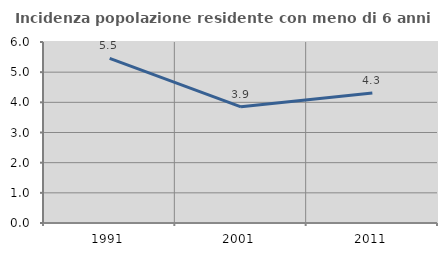
| Category | Incidenza popolazione residente con meno di 6 anni |
|---|---|
| 1991.0 | 5.459 |
| 2001.0 | 3.85 |
| 2011.0 | 4.312 |